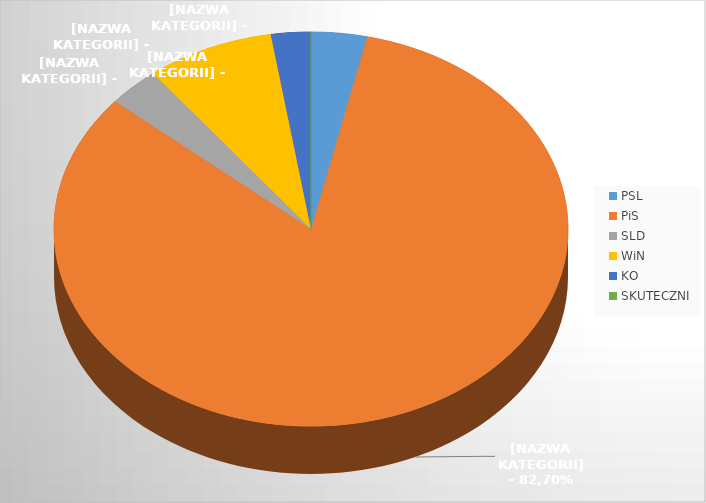
| Category | Series 0 |
|---|---|
| PSL | 14 |
| PiS | 330 |
| SLD | 13 |
| WiN | 32 |
| KO | 10 |
| SKUTECZNI | 0 |